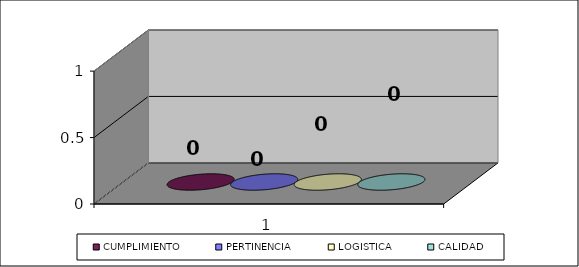
| Category | CUMPLIMIENTO | PERTINENCIA | LOGISTICA | CALIDAD |
|---|---|---|---|---|
| 0 | 0 | 0 | 0 | 0 |